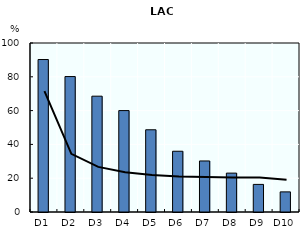
| Category | LAC |
|---|---|
| D1 | 90.226 |
| D2 | 80.148 |
| D3 | 68.532 |
| D4 | 60.01 |
| D5 | 48.654 |
| D6 | 35.956 |
| D7 | 30.198 |
| D8 | 23.008 |
| D9 | 16.332 |
| D10 | 11.906 |